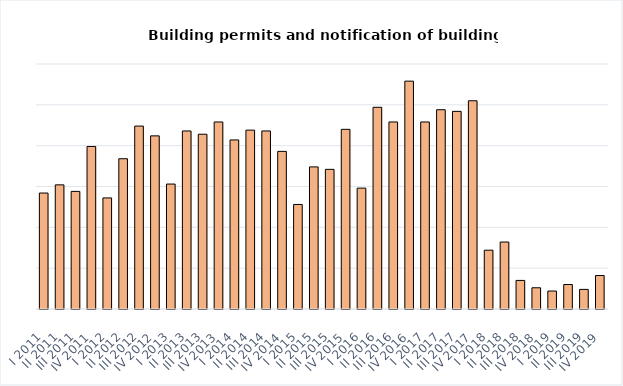
| Category | Building permits and notification of building work |
|---|---|
| I 2011 | 162 |
| II 2011 | 172 |
| III 2011 | 164 |
| IV 2011 | 219 |
| I 2012 | 156 |
| II 2012 | 204 |
| III 2012 | 244 |
| IV 2012 | 232 |
| I 2013 | 173 |
| II 2013 | 238 |
| III 2013 | 234 |
| IV 2013 | 249 |
| I 2014 | 227 |
| II 2014 | 239 |
| III 2014 | 238 |
| IV 2014 | 213 |
| I 2015 | 148 |
| II 2015 | 194 |
| III 2015 | 191 |
| IV 2015 | 240 |
| I 2016 | 168 |
| II 2016 | 267 |
| III 2016 | 249 |
| IV 2016 | 299 |
| I 2017 | 249 |
| II 2017 | 264 |
| III 2017 | 262 |
| IV 2017 | 275 |
| I 2018 | 92 |
| II 2018 | 102 |
| III 2018 | 55 |
| IV 2018 | 46 |
| I 2019 | 42 |
| II 2019 | 50 |
| III 2019 | 44 |
| IV 2019 | 61 |